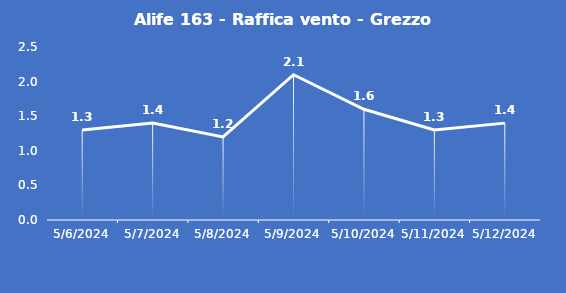
| Category | Alife 163 - Raffica vento - Grezzo (m/s) |
|---|---|
| 5/6/24 | 1.3 |
| 5/7/24 | 1.4 |
| 5/8/24 | 1.2 |
| 5/9/24 | 2.1 |
| 5/10/24 | 1.6 |
| 5/11/24 | 1.3 |
| 5/12/24 | 1.4 |